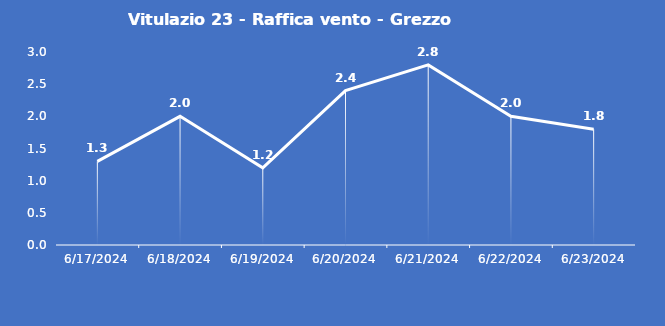
| Category | Vitulazio 23 - Raffica vento - Grezzo (m/s) |
|---|---|
| 6/17/24 | 1.3 |
| 6/18/24 | 2 |
| 6/19/24 | 1.2 |
| 6/20/24 | 2.4 |
| 6/21/24 | 2.8 |
| 6/22/24 | 2 |
| 6/23/24 | 1.8 |